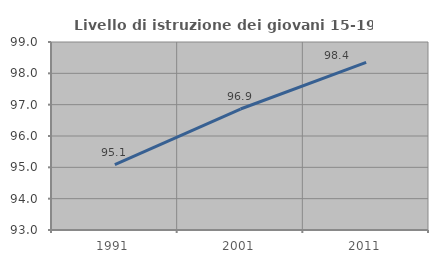
| Category | Livello di istruzione dei giovani 15-19 anni |
|---|---|
| 1991.0 | 95.089 |
| 2001.0 | 96.861 |
| 2011.0 | 98.351 |